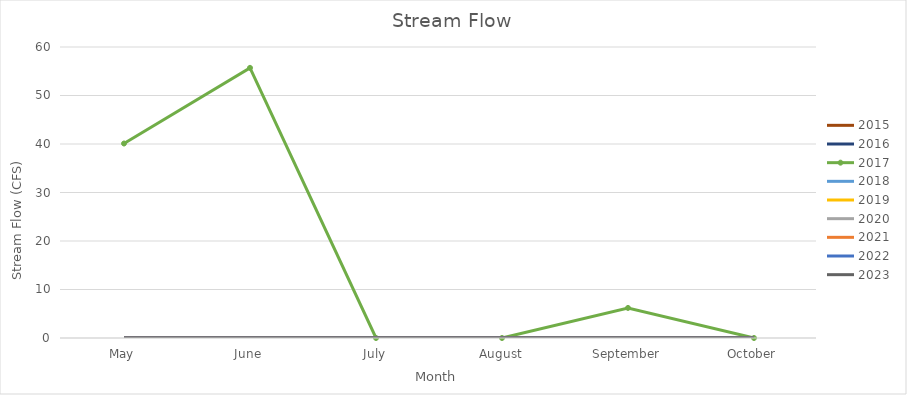
| Category | 2015 | 2016 | 2017 | 2018 | 2019 | 2020 | 2021 | 2022 | 2023 |
|---|---|---|---|---|---|---|---|---|---|
| May | 0 | 0 | 40.1 | 0 | 0 | 0 | 0 | 0 | 0 |
| June | 0 | 0 | 55.7 | 0 | 0 | 0 | 0 | 0 | 0 |
| July | 0 | 0 | 0 | 0 | 0 | 0 | 0 | 0 | 0 |
| August | 0 | 0 | 0 | 0 | 0 | 0 | 0 | 0 | 0 |
| September | 0 | 0 | 6.2 | 0 | 0 | 0 | 0 | 0 | 0 |
| October | 0 | 0 | 0 | 0 | 0 | 0 | 0 | 0 | 0 |